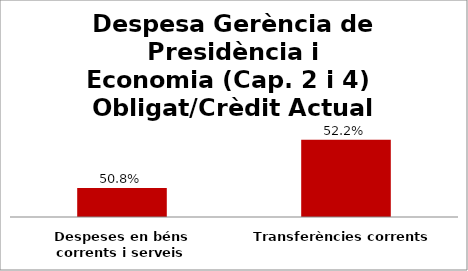
| Category | Series 0 |
|---|---|
| Despeses en béns corrents i serveis | 0.508 |
| Transferències corrents | 0.522 |